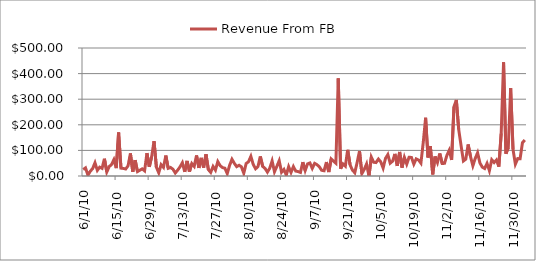
| Category | Revenue From FB |
|---|---|
| 6/1/10 | 25.236 |
| 6/2/10 | 31.656 |
| 6/3/10 | 3.124 |
| 6/4/10 | 18.618 |
| 6/5/10 | 28.871 |
| 6/6/10 | 51.668 |
| 6/7/10 | 22.052 |
| 6/8/10 | 34.674 |
| 6/9/10 | 30.035 |
| 6/10/10 | 67.4 |
| 6/11/10 | 15.8 |
| 6/12/10 | 36.575 |
| 6/13/10 | 44.869 |
| 6/14/10 | 63.718 |
| 6/15/10 | 30.934 |
| 6/16/10 | 169.896 |
| 6/17/10 | 30.742 |
| 6/18/10 | 29.549 |
| 6/19/10 | 27.354 |
| 6/20/10 | 39.842 |
| 6/21/10 | 88.374 |
| 6/22/10 | 16.559 |
| 6/23/10 | 62.135 |
| 6/24/10 | 17.239 |
| 6/25/10 | 22.672 |
| 6/26/10 | 27.959 |
| 6/27/10 | 20.25 |
| 6/28/10 | 89.445 |
| 6/29/10 | 35.778 |
| 6/30/10 | 75.486 |
| 7/1/10 | 136.225 |
| 7/2/10 | 34.292 |
| 7/3/10 | 12.366 |
| 7/4/10 | 44.432 |
| 7/5/10 | 33.75 |
| 7/6/10 | 79.885 |
| 7/7/10 | 29.954 |
| 7/8/10 | 33.236 |
| 7/9/10 | 26.615 |
| 7/10/10 | 11.742 |
| 7/11/10 | 22.75 |
| 7/12/10 | 35.495 |
| 7/13/10 | 51.869 |
| 7/14/10 | 16.242 |
| 7/15/10 | 58.9 |
| 7/16/10 | 17.154 |
| 7/17/10 | 48.61 |
| 7/18/10 | 37.616 |
| 7/19/10 | 80.334 |
| 7/20/10 | 31.518 |
| 7/21/10 | 70.819 |
| 7/22/10 | 32.854 |
| 7/23/10 | 84.848 |
| 7/24/10 | 25.14 |
| 7/25/10 | 14.142 |
| 7/26/10 | 37.351 |
| 7/27/10 | 22.991 |
| 7/28/10 | 56.214 |
| 7/29/10 | 40.354 |
| 7/30/10 | 32.899 |
| 7/31/10 | 30.5 |
| 8/1/10 | 9.371 |
| 8/2/10 | 41.556 |
| 8/3/10 | 65.302 |
| 8/4/10 | 49.498 |
| 8/5/10 | 36.558 |
| 8/6/10 | 41.846 |
| 8/7/10 | 35.869 |
| 8/8/10 | 10.682 |
| 8/9/10 | 48.666 |
| 8/10/10 | 55.721 |
| 8/11/10 | 76.78 |
| 8/12/10 | 45.232 |
| 8/13/10 | 28.24 |
| 8/14/10 | 36.72 |
| 8/15/10 | 76.508 |
| 8/16/10 | 37.502 |
| 8/17/10 | 29.735 |
| 8/18/10 | 15.208 |
| 8/19/10 | 30.586 |
| 8/20/10 | 58.942 |
| 8/21/10 | 16.494 |
| 8/22/10 | 37.562 |
| 8/23/10 | 59.68 |
| 8/24/10 | 14.744 |
| 8/25/10 | 25.616 |
| 8/26/10 | 3.374 |
| 8/27/10 | 36.362 |
| 8/28/10 | 13.868 |
| 8/29/10 | 36.862 |
| 8/30/10 | 19.114 |
| 8/31/10 | 17.368 |
| 9/1/10 | 13.868 |
| 9/2/10 | 54.176 |
| 9/3/10 | 21.241 |
| 9/4/10 | 47.166 |
| 9/5/10 | 50.851 |
| 9/6/10 | 29.7 |
| 9/7/10 | 49.406 |
| 9/8/10 | 44.322 |
| 9/9/10 | 35.672 |
| 9/10/10 | 22.181 |
| 9/11/10 | 20.552 |
| 9/12/10 | 54.346 |
| 9/13/10 | 15.511 |
| 9/14/10 | 66.53 |
| 9/15/10 | 57.975 |
| 9/16/10 | 49.92 |
| 9/17/10 | 381.331 |
| 9/18/10 | 28.768 |
| 9/19/10 | 47.005 |
| 9/20/10 | 38.435 |
| 9/21/10 | 102.259 |
| 9/22/10 | 43.714 |
| 9/23/10 | 23.182 |
| 9/24/10 | 12.616 |
| 9/25/10 | 53.025 |
| 9/26/10 | 97.305 |
| 9/27/10 | 9.372 |
| 9/28/10 | 25.674 |
| 9/29/10 | 46.921 |
| 9/30/10 | 0 |
| 10/1/10 | 73.745 |
| 10/2/10 | 53.731 |
| 10/3/10 | 52.476 |
| 10/4/10 | 66.152 |
| 10/5/10 | 55.286 |
| 10/6/10 | 31.034 |
| 10/7/10 | 68.7 |
| 10/8/10 | 83.514 |
| 10/9/10 | 50.025 |
| 10/10/10 | 57.794 |
| 10/11/10 | 86.276 |
| 10/12/10 | 39.48 |
| 10/13/10 | 94.048 |
| 10/14/10 | 32.788 |
| 10/15/10 | 72.92 |
| 10/16/10 | 46.349 |
| 10/17/10 | 73.352 |
| 10/18/10 | 72.516 |
| 10/19/10 | 46.355 |
| 10/20/10 | 66.77 |
| 10/21/10 | 62.431 |
| 10/22/10 | 50.279 |
| 10/23/10 | 131.762 |
| 10/24/10 | 227.538 |
| 10/25/10 | 72.342 |
| 10/26/10 | 116.799 |
| 10/27/10 | 6.245 |
| 10/28/10 | 76.259 |
| 10/29/10 | 52.455 |
| 10/30/10 | 88.06 |
| 10/31/10 | 49.171 |
| 11/1/10 | 49.356 |
| 11/2/10 | 80.654 |
| 11/3/10 | 100.529 |
| 11/4/10 | 62.749 |
| 11/5/10 | 270.624 |
| 11/6/10 | 297.04 |
| 11/7/10 | 182.17 |
| 11/8/10 | 119.296 |
| 11/9/10 | 58.348 |
| 11/10/10 | 65.698 |
| 11/11/10 | 123.222 |
| 11/12/10 | 76.024 |
| 11/13/10 | 40.056 |
| 11/14/10 | 68.341 |
| 11/15/10 | 90.596 |
| 11/16/10 | 50.686 |
| 11/17/10 | 34.604 |
| 11/18/10 | 29.17 |
| 11/19/10 | 49.2 |
| 11/20/10 | 20.799 |
| 11/21/10 | 63.546 |
| 11/22/10 | 52.671 |
| 11/23/10 | 62.714 |
| 11/24/10 | 36.488 |
| 11/25/10 | 166.482 |
| 11/26/10 | 444 |
| 11/27/10 | 87.144 |
| 11/28/10 | 110.98 |
| 11/29/10 | 344 |
| 11/30/10 | 104.436 |
| 12/1/10 | 46.368 |
| 12/2/10 | 67.94 |
| 12/3/10 | 67.532 |
| 12/4/10 | 129.876 |
| 12/5/10 | 140.825 |